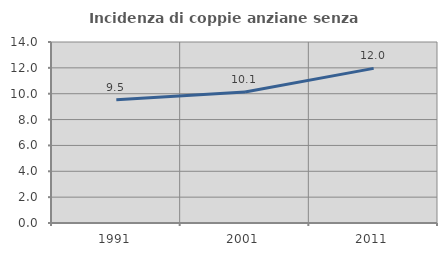
| Category | Incidenza di coppie anziane senza figli  |
|---|---|
| 1991.0 | 9.535 |
| 2001.0 | 10.138 |
| 2011.0 | 11.96 |